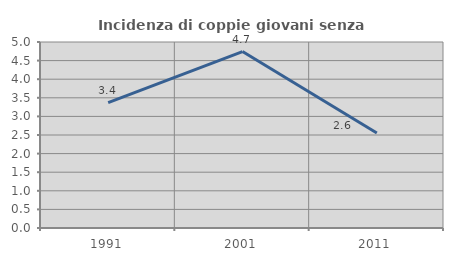
| Category | Incidenza di coppie giovani senza figli |
|---|---|
| 1991.0 | 3.371 |
| 2001.0 | 4.743 |
| 2011.0 | 2.555 |